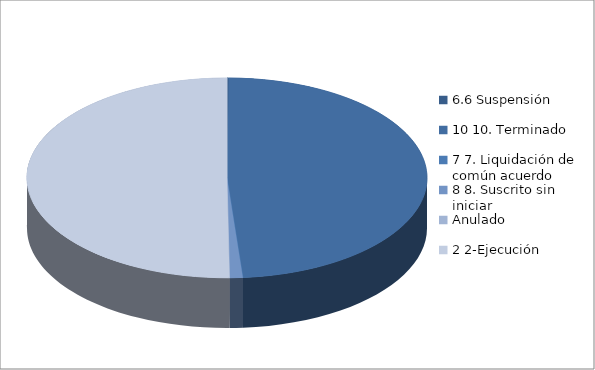
| Category | Series 0 |
|---|---|
| 6.6 Suspensión | 1 |
| 10 10. Terminado | 366 |
| 7 7. Liquidación de común acuerdo | 0 |
| 8 8. Suscrito sin iniciar | 8 |
| Anulado | 0 |
| 2 2-Ejecución | 378 |